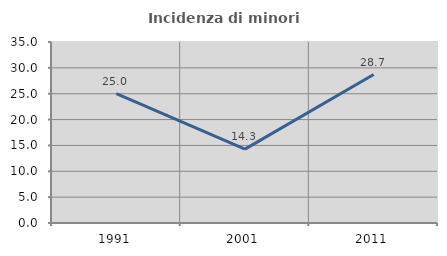
| Category | Incidenza di minori stranieri |
|---|---|
| 1991.0 | 25 |
| 2001.0 | 14.286 |
| 2011.0 | 28.71 |